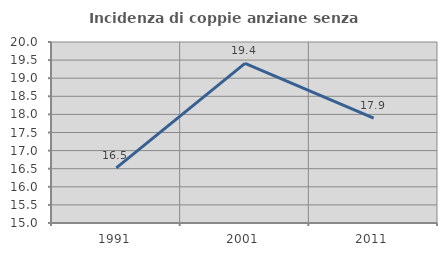
| Category | Incidenza di coppie anziane senza figli  |
|---|---|
| 1991.0 | 16.524 |
| 2001.0 | 19.409 |
| 2011.0 | 17.897 |